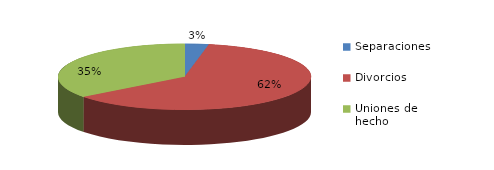
| Category | Series 0 |
|---|---|
| Separaciones | 39 |
| Divorcios | 782 |
| Uniones de hecho | 449 |